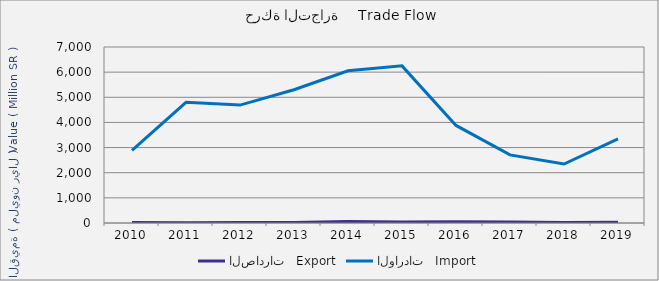
| Category | الصادرات   Export | الواردات   Import |
|---|---|---|
| 2010.0 | 22254071 | 2887058294 |
| 2011.0 | 7644227 | 4800236522 |
| 2012.0 | 17538661 | 4688971214 |
| 2013.0 | 16646967 | 5301874058 |
| 2014.0 | 60081759 | 6054683392 |
| 2015.0 | 39939165 | 6249099432 |
| 2016.0 | 49438262 | 3880509914 |
| 2017.0 | 38344734 | 2708062128 |
| 2018.0 | 23264840 | 2347052420 |
| 2019.0 | 29502741 | 3344519039 |